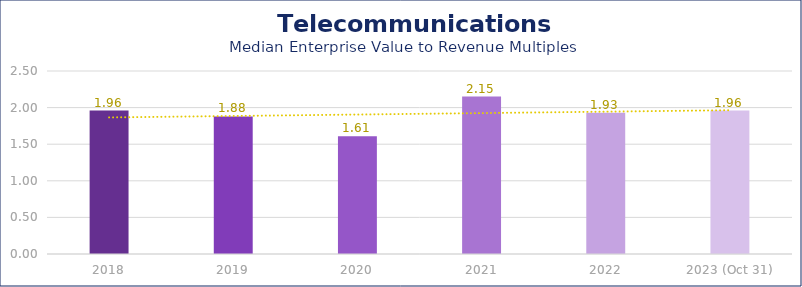
| Category | Telecommunications |
|---|---|
| 2018 | 1.96 |
| 2019 | 1.88 |
| 2020 | 1.61 |
| 2021 | 2.15 |
| 2022 | 1.93 |
| 2023 (Oct 31) | 1.96 |